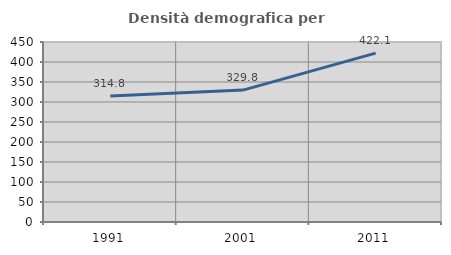
| Category | Densità demografica |
|---|---|
| 1991.0 | 314.779 |
| 2001.0 | 329.803 |
| 2011.0 | 422.148 |